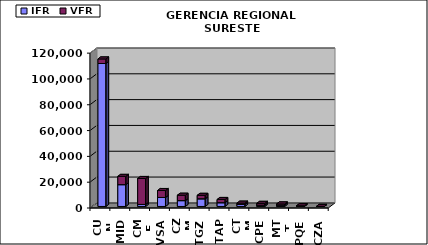
| Category | IFR | VFR |
|---|---|---|
| CUN | 110773 | 3530 |
| MID | 16913 | 6389 |
| CME | 1586 | 20074 |
| VSA | 6968 | 5375 |
| CZM | 4533 | 4164 |
| TGZ | 5966 | 2652 |
| TAP | 2923 | 2484 |
| CTM | 1644 | 923 |
| CPE | 1057 | 1345 |
| MTT | 1082 | 881 |
| PQE | 210 | 317 |
| CZA | 0 | 0 |